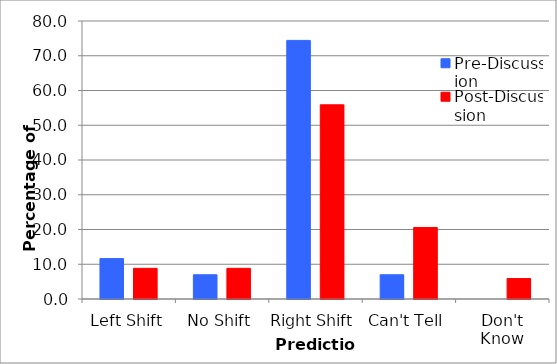
| Category | Pre-Discussion | Post-Discussion |
|---|---|---|
| Left Shift | 11.628 | 8.824 |
| No Shift | 6.977 | 8.824 |
| Right Shift | 74.419 | 55.882 |
| Can't Tell | 6.977 | 20.588 |
| Don't Know | 0 | 5.882 |